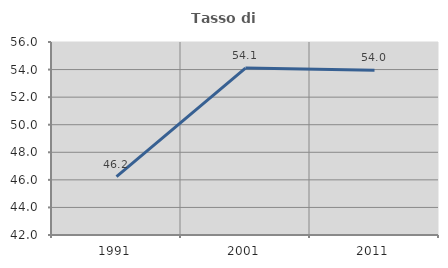
| Category | Tasso di occupazione   |
|---|---|
| 1991.0 | 46.24 |
| 2001.0 | 54.112 |
| 2011.0 | 53.953 |